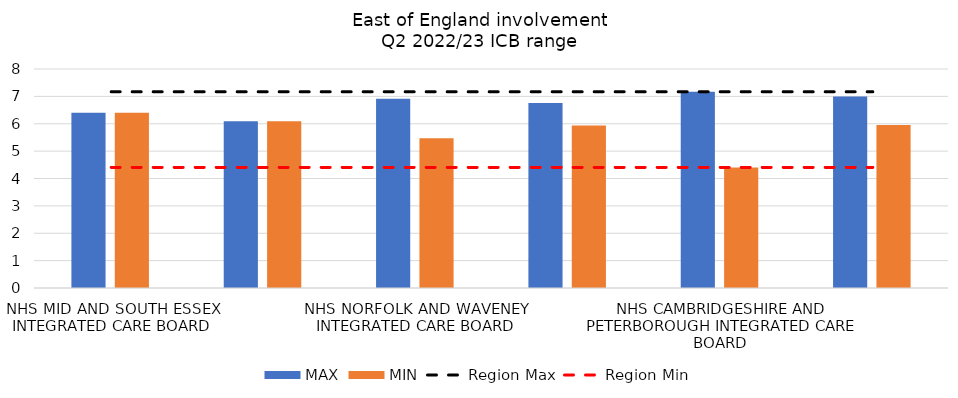
| Category | MAX | MIN |
|---|---|---|
| NHS MID AND SOUTH ESSEX INTEGRATED CARE BOARD | 6.399 | 6.399 |
| NHS BEDFORDSHIRE, LUTON AND MILTON KEYNES INTEGRATED CARE BOARD | 6.096 | 6.096 |
| NHS NORFOLK AND WAVENEY INTEGRATED CARE BOARD | 6.917 | 5.47 |
| NHS SUFFOLK AND NORTH EAST ESSEX INTEGRATED CARE BOARD | 6.754 | 5.94 |
| NHS CAMBRIDGESHIRE AND PETERBOROUGH INTEGRATED CARE BOARD | 7.168 | 4.406 |
| NHS HERTFORDSHIRE AND WEST ESSEX INTEGRATED CARE BOARD | 6.993 | 5.955 |